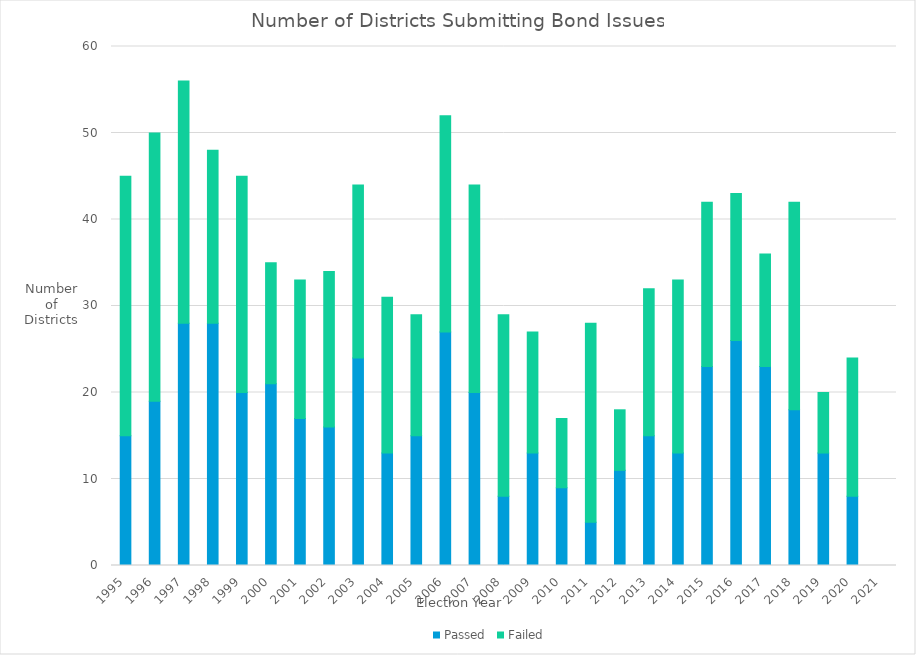
| Category | Passed | Failed |
|---|---|---|
| 1995 | 15 | 30 |
| 1996 | 19 | 31 |
| 1997 | 28 | 28 |
| 1998 | 28 | 20 |
| 1999 | 20 | 25 |
| 2000 | 21 | 14 |
| 2001 | 17 | 16 |
| 2002 | 16 | 18 |
| 2003 | 24 | 20 |
| 2004 | 13 | 18 |
| 2005 | 15 | 14 |
| 2006 | 27 | 25 |
| 2007 | 20 | 24 |
| 2008 | 8 | 21 |
| 2009 | 13 | 14 |
| 2010 | 9 | 8 |
| 2011 | 5 | 23 |
| 2012 | 11 | 7 |
| 2013 | 15 | 17 |
| 2014 | 13 | 20 |
| 2015 | 23 | 19 |
| 2016 | 26 | 17 |
| 2017 | 23 | 13 |
| 2018 | 18 | 24 |
| 2019 | 13 | 7 |
| 2020 | 8 | 16 |
| 2021 | 0 | 0 |